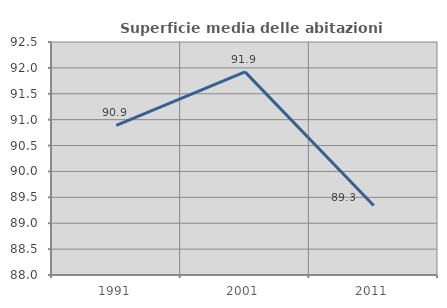
| Category | Superficie media delle abitazioni occupate |
|---|---|
| 1991.0 | 90.89 |
| 2001.0 | 91.923 |
| 2011.0 | 89.341 |